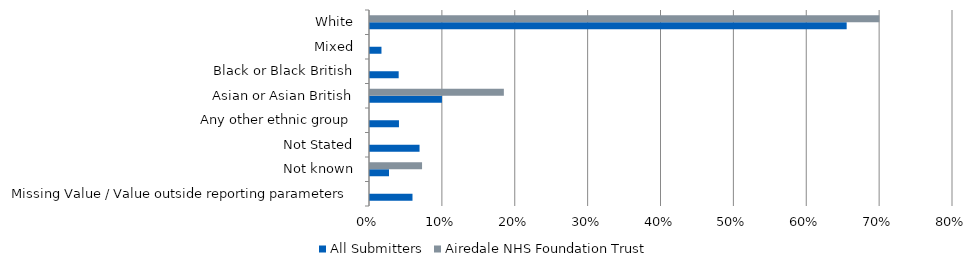
| Category | All Submitters | Airedale NHS Foundation Trust |
|---|---|---|
| Missing Value / Value outside reporting parameters | 0.058 | 0 |
| Not known | 0.026 | 0.071 |
| Not Stated | 0.068 | 0 |
| Any other ethnic group | 0.04 | 0 |
| Asian or Asian British | 0.099 | 0.184 |
| Black or Black British | 0.039 | 0 |
| Mixed | 0.016 | 0 |
| White | 0.654 | 0.699 |